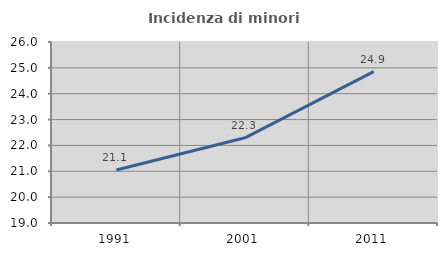
| Category | Incidenza di minori stranieri |
|---|---|
| 1991.0 | 21.053 |
| 2001.0 | 22.295 |
| 2011.0 | 24.855 |